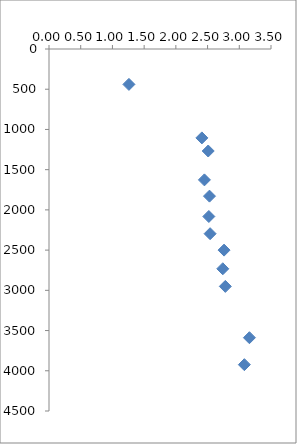
| Category | Series 0 |
|---|---|
| 1.26 | 440 |
| 2.41 | 1105 |
| 2.51 | 1268 |
| 2.45 | 1627 |
| 2.53 | 1829 |
| 2.52 | 2082 |
| 2.54 | 2296 |
| 2.76 | 2500 |
| 2.74 | 2732 |
| 2.78 | 2951 |
| 3.16 | 3589 |
| 3.08 | 3924 |